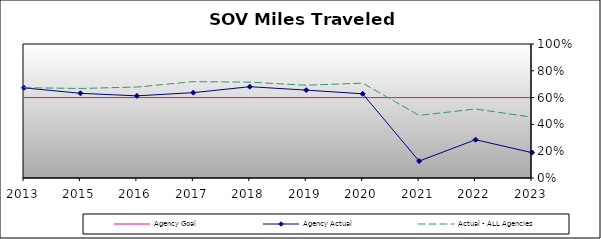
| Category | Agency Goal | Agency Actual | Actual - ALL Agencies |
|---|---|---|---|
| 2013.0 | 0.6 | 0.673 | 0.674 |
| 2015.0 | 0.6 | 0.632 | 0.668 |
| 2016.0 | 0.6 | 0.613 | 0.679 |
| 2017.0 | 0.6 | 0.637 | 0.719 |
| 2018.0 | 0.6 | 0.681 | 0.715 |
| 2019.0 | 0.6 | 0.656 | 0.692 |
| 2020.0 | 0.6 | 0.628 | 0.708 |
| 2021.0 | 0.6 | 0.126 | 0.467 |
| 2022.0 | 0.6 | 0.286 | 0.515 |
| 2023.0 | 0.6 | 0.189 | 0.454 |